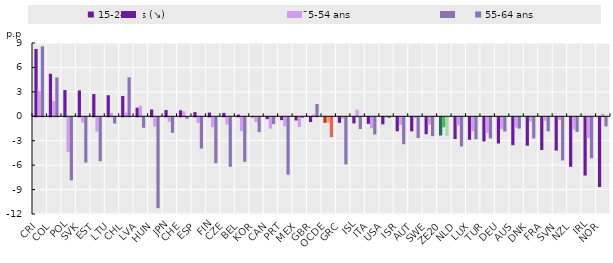
| Category | 15-24 ans (↘) | 25-54 ans | 55-64 ans |
|---|---|---|---|
| CRI | 8.267 | 3.082 | 8.595 |
| COL | 5.221 | 1.867 | 4.772 |
| POL | 3.22 | -4.283 | -7.742 |
| SVK | 3.178 | -0.633 | -5.564 |
| EST | 2.73 | -1.752 | -5.401 |
| LTU | 2.586 | 0.428 | -0.767 |
| CHL | 2.487 | 0.454 | 4.777 |
| LVA | 1.061 | 1.306 | -1.283 |
| HUN | 0.832 | -1.157 | -11.161 |
| JPN | 0.765 | -0.556 | -1.914 |
| CHE | 0.735 | 0.616 | -0.183 |
| ESP | 0.515 | -0.704 | -3.839 |
| FIN | 0.455 | -1.218 | -5.638 |
| CZE | 0.412 | -0.9 | -6.079 |
| BEL | 0.211 | -1.695 | -5.463 |
| KOR | -0.015 | -0.58 | -1.822 |
| CAN | -0.231 | -1.399 | -0.846 |
| PRT | -0.349 | -1.099 | -7.057 |
| MEX | -0.391 | -1.192 | -0.08 |
| GBR | -0.587 | 0.223 | 1.511 |
| OCDE | -0.683 | -0.638 | -2.431 |
| GRC | -0.684 | -0.19 | -5.794 |
| ISL | -0.747 | 0.805 | -1.439 |
| ITA | -0.805 | -1.336 | -2.107 |
| USA | -0.865 | -0.033 | -0.093 |
| ISR | -1.718 | -0.944 | -3.308 |
| AUT | -1.73 | -0.102 | -2.541 |
| SWE | -2.079 | -0.908 | -2.318 |
| ZE20 | -2.24 | -1.236 | -2.285 |
| NLD | -2.665 | -1.019 | -3.57 |
| LUX | -2.764 | -1.693 | -2.71 |
| TUR | -2.967 | -1.922 | -2.585 |
| DEU | -3.216 | -1.442 | -1.746 |
| AUS | -3.429 | -1.26 | -1.391 |
| DNK | -3.493 | -0.539 | -2.592 |
| FRA | -4.02 | -0.412 | -1.734 |
| SVN | -4.087 | -0.335 | -5.304 |
| NZL | -6.078 | -1.486 | -1.788 |
| IRL | -7.15 | -2.559 | -5.037 |
| NOR | -8.567 | 0.323 | -1.121 |